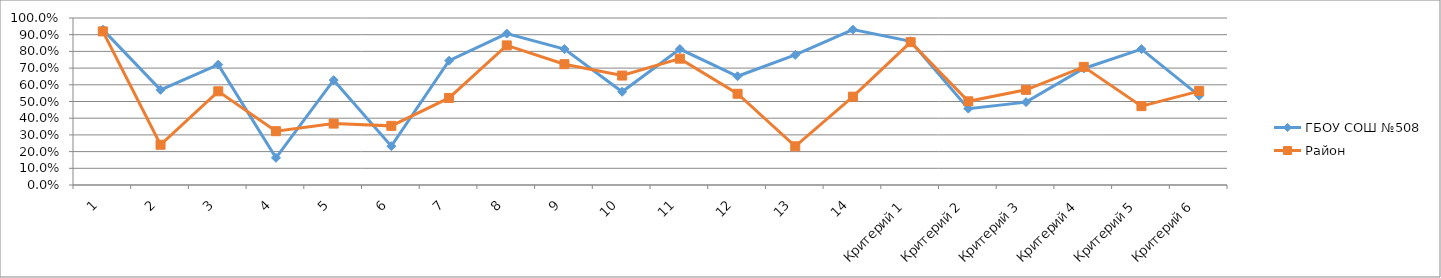
| Category | ГБОУ СОШ №508 | Район |
|---|---|---|
| 1 | 0.93 | 0.92 |
| 2 | 0.57 | 0.241 |
| 3 | 0.721 | 0.561 |
| 4 | 0.163 | 0.322 |
| 5 | 0.628 | 0.368 |
| 6 | 0.233 | 0.354 |
| 7 | 0.744 | 0.521 |
| 8 | 0.907 | 0.836 |
| 9 | 0.814 | 0.723 |
| 10 | 0.558 | 0.655 |
| 11 | 0.814 | 0.756 |
| 12 | 0.651 | 0.546 |
| 13 | 0.779 | 0.232 |
| 14 | 0.93 | 0.529 |
| Критерий 1 | 0.86 | 0.855 |
| Критерий 2 | 0.457 | 0.501 |
| Критерий 3 | 0.496 | 0.57 |
| Критерий 4 | 0.698 | 0.707 |
| Критерий 5 | 0.814 | 0.472 |
| Критерий 6 | 0.535 | 0.562 |